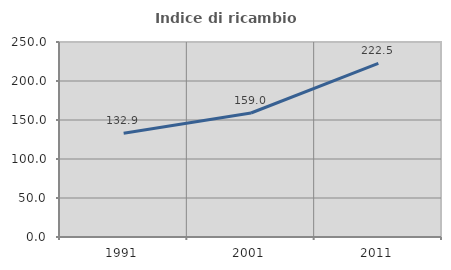
| Category | Indice di ricambio occupazionale  |
|---|---|
| 1991.0 | 132.883 |
| 2001.0 | 159 |
| 2011.0 | 222.513 |